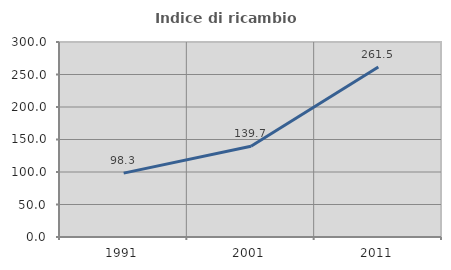
| Category | Indice di ricambio occupazionale  |
|---|---|
| 1991.0 | 98.264 |
| 2001.0 | 139.689 |
| 2011.0 | 261.494 |